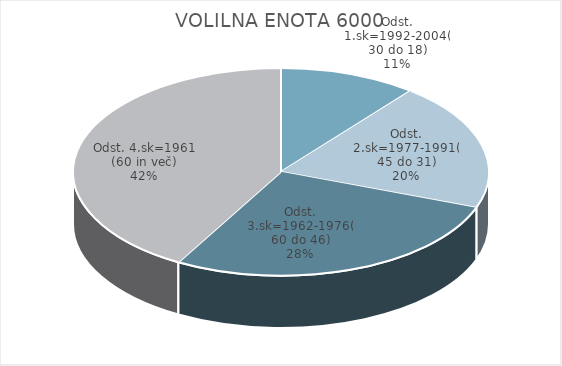
| Category | VOLILNA ENOTA 6000 |
|---|---|
| Odst. 1.sk=1992-2004(30 do 18) | 5.43 |
| Odst. 2.sk=1977-1991(45 do 31) | 10.06 |
| Odst. 3.sk=1962-1976(60 do 46) | 13.98 |
| Odst. 4.sk=1961 (60 in več) | 21.16 |